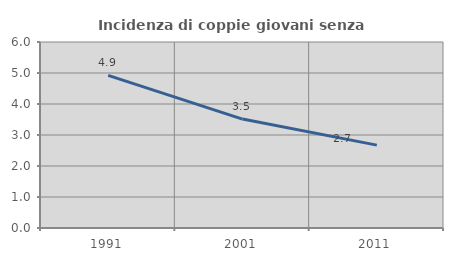
| Category | Incidenza di coppie giovani senza figli |
|---|---|
| 1991.0 | 4.923 |
| 2001.0 | 3.514 |
| 2011.0 | 2.674 |